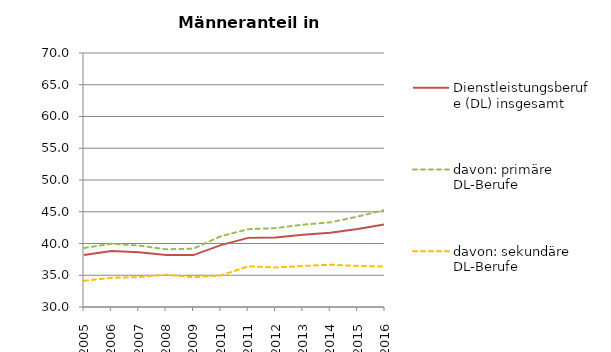
| Category | Dienstleistungsberufe (DL) insgesamt | davon: primäre DL-Berufe | davon: sekundäre DL-Berufe |
|---|---|---|---|
| 2005 | 38.171 | 39.294 | 34.123 |
| 2006 | 38.82 | 39.959 | 34.614 |
| 2007 | 38.624 | 39.681 | 34.706 |
| 2008 | 38.2 | 39.092 | 35.083 |
| 2009 | 38.17 | 39.187 | 34.683 |
| 2010 | 39.742 | 41.147 | 34.965 |
| 2011 | 40.886 | 42.252 | 36.396 |
| 2012 | 40.936 | 42.426 | 36.229 |
| 2013 | 41.376 | 42.97 | 36.453 |
| 2014 | 41.68 | 43.33 | 36.661 |
| 2015 | 42.28 | 44.242 | 36.47 |
| 2016 | 43.009 | 45.287 | 36.36 |